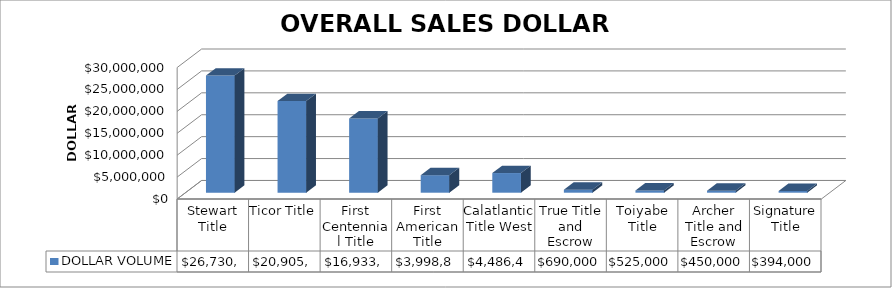
| Category | DOLLAR VOLUME |
|---|---|
| Stewart Title | 26730919 |
| Ticor Title | 20905547 |
| First Centennial Title | 16933181.29 |
| First American Title | 3998886 |
| Calatlantic Title West | 4486482 |
| True Title and Escrow | 690000 |
| Toiyabe Title | 525000 |
| Archer Title and Escrow | 450000 |
| Signature Title | 394000 |